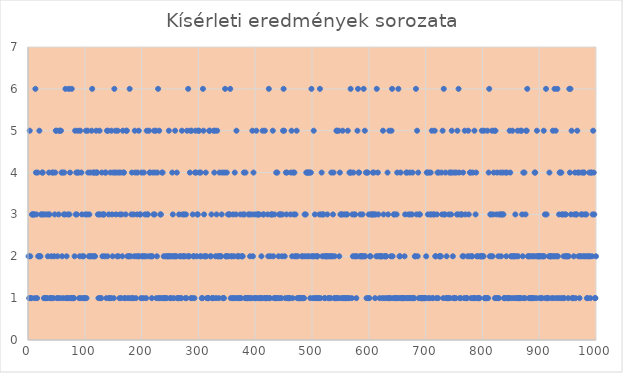
| Category | Series 0 |
|---|---|
| 1.0 | 2 |
| 2.0 | 1 |
| 3.0 | 5 |
| 4.0 | 2 |
| 5.0 | 1 |
| 6.0 | 1 |
| 7.0 | 3 |
| 8.0 | 3 |
| 9.0 | 3 |
| 10.0 | 3 |
| 11.0 | 3 |
| 12.0 | 1 |
| 13.0 | 6 |
| 14.0 | 4 |
| 15.0 | 3 |
| 16.0 | 1 |
| 17.0 | 4 |
| 18.0 | 2 |
| 19.0 | 2 |
| 20.0 | 5 |
| 21.0 | 2 |
| 22.0 | 2 |
| 23.0 | 3 |
| 24.0 | 3 |
| 25.0 | 4 |
| 26.0 | 4 |
| 27.0 | 3 |
| 28.0 | 1 |
| 29.0 | 3 |
| 30.0 | 1 |
| 31.0 | 1 |
| 32.0 | 1 |
| 33.0 | 3 |
| 34.0 | 1 |
| 35.0 | 2 |
| 36.0 | 3 |
| 37.0 | 4 |
| 38.0 | 3 |
| 39.0 | 1 |
| 40.0 | 1 |
| 41.0 | 2 |
| 42.0 | 1 |
| 43.0 | 4 |
| 44.0 | 4 |
| 45.0 | 1 |
| 46.0 | 2 |
| 47.0 | 3 |
| 48.0 | 4 |
| 49.0 | 5 |
| 50.0 | 5 |
| 51.0 | 1 |
| 52.0 | 2 |
| 53.0 | 1 |
| 54.0 | 3 |
| 55.0 | 5 |
| 56.0 | 5 |
| 57.0 | 1 |
| 58.0 | 5 |
| 59.0 | 4 |
| 60.0 | 2 |
| 61.0 | 4 |
| 62.0 | 1 |
| 63.0 | 3 |
| 64.0 | 4 |
| 65.0 | 3 |
| 66.0 | 6 |
| 67.0 | 1 |
| 68.0 | 2 |
| 69.0 | 1 |
| 70.0 | 3 |
| 71.0 | 1 |
| 72.0 | 6 |
| 73.0 | 3 |
| 74.0 | 4 |
| 75.0 | 1 |
| 76.0 | 1 |
| 77.0 | 6 |
| 78.0 | 1 |
| 79.0 | 1 |
| 80.0 | 1 |
| 81.0 | 1 |
| 82.0 | 2 |
| 83.0 | 5 |
| 84.0 | 3 |
| 85.0 | 4 |
| 86.0 | 3 |
| 87.0 | 4 |
| 88.0 | 5 |
| 89.0 | 4 |
| 90.0 | 1 |
| 91.0 | 2 |
| 92.0 | 5 |
| 93.0 | 1 |
| 94.0 | 4 |
| 95.0 | 3 |
| 96.0 | 2 |
| 97.0 | 1 |
| 98.0 | 2 |
| 99.0 | 1 |
| 100.0 | 1 |
| 101.0 | 3 |
| 102.0 | 5 |
| 103.0 | 1 |
| 104.0 | 3 |
| 105.0 | 5 |
| 106.0 | 4 |
| 107.0 | 2 |
| 108.0 | 3 |
| 109.0 | 2 |
| 110.0 | 4 |
| 111.0 | 2 |
| 112.0 | 5 |
| 113.0 | 6 |
| 114.0 | 2 |
| 115.0 | 4 |
| 116.0 | 4 |
| 117.0 | 2 |
| 118.0 | 2 |
| 119.0 | 4 |
| 120.0 | 5 |
| 121.0 | 4 |
| 122.0 | 4 |
| 123.0 | 3 |
| 124.0 | 1 |
| 125.0 | 3 |
| 126.0 | 5 |
| 127.0 | 1 |
| 128.0 | 3 |
| 129.0 | 1 |
| 130.0 | 4 |
| 131.0 | 2 |
| 132.0 | 3 |
| 133.0 | 3 |
| 134.0 | 3 |
| 135.0 | 2 |
| 136.0 | 4 |
| 137.0 | 4 |
| 138.0 | 1 |
| 139.0 | 5 |
| 140.0 | 2 |
| 141.0 | 5 |
| 142.0 | 3 |
| 143.0 | 1 |
| 144.0 | 1 |
| 145.0 | 4 |
| 146.0 | 1 |
| 147.0 | 5 |
| 148.0 | 3 |
| 149.0 | 2 |
| 150.0 | 4 |
| 151.0 | 1 |
| 152.0 | 6 |
| 153.0 | 4 |
| 154.0 | 5 |
| 155.0 | 3 |
| 156.0 | 4 |
| 157.0 | 2 |
| 158.0 | 5 |
| 159.0 | 2 |
| 160.0 | 4 |
| 161.0 | 1 |
| 162.0 | 3 |
| 163.0 | 4 |
| 164.0 | 1 |
| 165.0 | 3 |
| 166.0 | 2 |
| 167.0 | 5 |
| 168.0 | 4 |
| 169.0 | 4 |
| 170.0 | 1 |
| 171.0 | 1 |
| 172.0 | 3 |
| 173.0 | 5 |
| 174.0 | 5 |
| 175.0 | 2 |
| 176.0 | 1 |
| 177.0 | 2 |
| 178.0 | 2 |
| 179.0 | 6 |
| 180.0 | 1 |
| 181.0 | 2 |
| 182.0 | 3 |
| 183.0 | 4 |
| 184.0 | 1 |
| 185.0 | 1 |
| 186.0 | 3 |
| 187.0 | 2 |
| 188.0 | 5 |
| 189.0 | 4 |
| 190.0 | 1 |
| 191.0 | 2 |
| 192.0 | 3 |
| 193.0 | 4 |
| 194.0 | 2 |
| 195.0 | 5 |
| 196.0 | 2 |
| 197.0 | 3 |
| 198.0 | 3 |
| 199.0 | 1 |
| 200.0 | 4 |
| 201.0 | 2 |
| 202.0 | 2 |
| 203.0 | 1 |
| 204.0 | 4 |
| 205.0 | 2 |
| 206.0 | 3 |
| 207.0 | 2 |
| 208.0 | 1 |
| 209.0 | 5 |
| 210.0 | 3 |
| 211.0 | 3 |
| 212.0 | 2 |
| 213.0 | 5 |
| 214.0 | 4 |
| 215.0 | 4 |
| 216.0 | 2 |
| 217.0 | 2 |
| 218.0 | 1 |
| 219.0 | 2 |
| 220.0 | 4 |
| 221.0 | 3 |
| 222.0 | 5 |
| 223.0 | 3 |
| 224.0 | 4 |
| 225.0 | 5 |
| 226.0 | 1 |
| 227.0 | 2 |
| 228.0 | 4 |
| 229.0 | 6 |
| 230.0 | 1 |
| 231.0 | 5 |
| 232.0 | 1 |
| 233.0 | 3 |
| 234.0 | 3 |
| 235.0 | 1 |
| 236.0 | 4 |
| 237.0 | 4 |
| 238.0 | 1 |
| 239.0 | 2 |
| 240.0 | 1 |
| 241.0 | 1 |
| 242.0 | 2 |
| 243.0 | 1 |
| 244.0 | 1 |
| 245.0 | 2 |
| 246.0 | 2 |
| 247.0 | 2 |
| 248.0 | 5 |
| 249.0 | 2 |
| 250.0 | 1 |
| 251.0 | 2 |
| 252.0 | 1 |
| 253.0 | 2 |
| 254.0 | 4 |
| 255.0 | 3 |
| 256.0 | 2 |
| 257.0 | 1 |
| 258.0 | 2 |
| 259.0 | 5 |
| 260.0 | 2 |
| 261.0 | 2 |
| 262.0 | 4 |
| 263.0 | 1 |
| 264.0 | 1 |
| 265.0 | 1 |
| 266.0 | 3 |
| 267.0 | 2 |
| 268.0 | 1 |
| 269.0 | 2 |
| 270.0 | 1 |
| 271.0 | 5 |
| 272.0 | 3 |
| 273.0 | 2 |
| 274.0 | 2 |
| 275.0 | 3 |
| 276.0 | 2 |
| 277.0 | 1 |
| 278.0 | 3 |
| 279.0 | 1 |
| 280.0 | 5 |
| 281.0 | 2 |
| 282.0 | 6 |
| 283.0 | 2 |
| 284.0 | 2 |
| 285.0 | 4 |
| 286.0 | 5 |
| 287.0 | 1 |
| 288.0 | 5 |
| 289.0 | 1 |
| 290.0 | 3 |
| 291.0 | 2 |
| 292.0 | 2 |
| 293.0 | 1 |
| 294.0 | 4 |
| 295.0 | 5 |
| 296.0 | 4 |
| 297.0 | 2 |
| 298.0 | 3 |
| 299.0 | 3 |
| 300.0 | 5 |
| 301.0 | 5 |
| 302.0 | 4 |
| 303.0 | 2 |
| 304.0 | 4 |
| 305.0 | 2 |
| 306.0 | 1 |
| 307.0 | 1 |
| 308.0 | 6 |
| 309.0 | 5 |
| 310.0 | 3 |
| 311.0 | 2 |
| 312.0 | 2 |
| 313.0 | 4 |
| 314.0 | 2 |
| 315.0 | 1 |
| 316.0 | 1 |
| 317.0 | 1 |
| 318.0 | 1 |
| 319.0 | 5 |
| 320.0 | 5 |
| 321.0 | 2 |
| 322.0 | 2 |
| 323.0 | 3 |
| 324.0 | 1 |
| 325.0 | 1 |
| 326.0 | 1 |
| 327.0 | 5 |
| 328.0 | 4 |
| 329.0 | 5 |
| 330.0 | 2 |
| 331.0 | 1 |
| 332.0 | 3 |
| 333.0 | 5 |
| 334.0 | 2 |
| 335.0 | 2 |
| 336.0 | 1 |
| 337.0 | 4 |
| 338.0 | 2 |
| 339.0 | 2 |
| 340.0 | 2 |
| 341.0 | 3 |
| 342.0 | 4 |
| 343.0 | 1 |
| 344.0 | 1 |
| 345.0 | 1 |
| 346.0 | 4 |
| 347.0 | 6 |
| 348.0 | 2 |
| 349.0 | 2 |
| 350.0 | 4 |
| 351.0 | 2 |
| 352.0 | 3 |
| 353.0 | 2 |
| 354.0 | 3 |
| 355.0 | 3 |
| 356.0 | 6 |
| 357.0 | 1 |
| 358.0 | 2 |
| 359.0 | 2 |
| 360.0 | 1 |
| 361.0 | 3 |
| 362.0 | 1 |
| 363.0 | 2 |
| 364.0 | 4 |
| 365.0 | 1 |
| 366.0 | 3 |
| 367.0 | 5 |
| 368.0 | 1 |
| 369.0 | 2 |
| 370.0 | 2 |
| 371.0 | 2 |
| 372.0 | 1 |
| 373.0 | 1 |
| 374.0 | 3 |
| 375.0 | 1 |
| 376.0 | 2 |
| 377.0 | 2 |
| 378.0 | 2 |
| 379.0 | 3 |
| 380.0 | 4 |
| 381.0 | 3 |
| 382.0 | 1 |
| 383.0 | 4 |
| 384.0 | 1 |
| 385.0 | 1 |
| 386.0 | 1 |
| 387.0 | 1 |
| 388.0 | 3 |
| 389.0 | 1 |
| 390.0 | 3 |
| 391.0 | 2 |
| 392.0 | 1 |
| 393.0 | 1 |
| 394.0 | 3 |
| 395.0 | 5 |
| 396.0 | 2 |
| 397.0 | 4 |
| 398.0 | 1 |
| 399.0 | 3 |
| 400.0 | 1 |
| 401.0 | 1 |
| 402.0 | 5 |
| 403.0 | 3 |
| 404.0 | 1 |
| 405.0 | 3 |
| 406.0 | 3 |
| 407.0 | 3 |
| 408.0 | 1 |
| 409.0 | 1 |
| 410.0 | 1 |
| 411.0 | 2 |
| 412.0 | 1 |
| 413.0 | 5 |
| 414.0 | 3 |
| 415.0 | 3 |
| 416.0 | 1 |
| 417.0 | 5 |
| 418.0 | 1 |
| 419.0 | 1 |
| 420.0 | 1 |
| 421.0 | 1 |
| 422.0 | 3 |
| 423.0 | 2 |
| 424.0 | 6 |
| 425.0 | 1 |
| 426.0 | 1 |
| 427.0 | 2 |
| 428.0 | 3 |
| 429.0 | 3 |
| 430.0 | 3 |
| 431.0 | 5 |
| 432.0 | 2 |
| 433.0 | 1 |
| 434.0 | 3 |
| 435.0 | 1 |
| 436.0 | 1 |
| 437.0 | 4 |
| 438.0 | 1 |
| 439.0 | 4 |
| 440.0 | 1 |
| 441.0 | 2 |
| 442.0 | 3 |
| 443.0 | 1 |
| 444.0 | 3 |
| 445.0 | 3 |
| 446.0 | 1 |
| 447.0 | 2 |
| 448.0 | 3 |
| 449.0 | 5 |
| 450.0 | 6 |
| 451.0 | 5 |
| 452.0 | 2 |
| 453.0 | 1 |
| 454.0 | 4 |
| 455.0 | 3 |
| 456.0 | 4 |
| 457.0 | 1 |
| 458.0 | 1 |
| 459.0 | 1 |
| 460.0 | 1 |
| 461.0 | 1 |
| 462.0 | 3 |
| 463.0 | 4 |
| 464.0 | 5 |
| 465.0 | 2 |
| 466.0 | 1 |
| 467.0 | 4 |
| 468.0 | 3 |
| 469.0 | 4 |
| 470.0 | 2 |
| 471.0 | 3 |
| 472.0 | 2 |
| 473.0 | 5 |
| 474.0 | 1 |
| 475.0 | 2 |
| 476.0 | 1 |
| 477.0 | 1 |
| 478.0 | 1 |
| 479.0 | 1 |
| 480.0 | 1 |
| 481.0 | 1 |
| 482.0 | 2 |
| 483.0 | 1 |
| 484.0 | 2 |
| 485.0 | 1 |
| 486.0 | 1 |
| 487.0 | 3 |
| 488.0 | 2 |
| 489.0 | 3 |
| 490.0 | 4 |
| 491.0 | 4 |
| 492.0 | 2 |
| 493.0 | 4 |
| 494.0 | 4 |
| 495.0 | 2 |
| 496.0 | 4 |
| 497.0 | 1 |
| 498.0 | 4 |
| 499.0 | 6 |
| 500.0 | 2 |
| 501.0 | 2 |
| 502.0 | 1 |
| 503.0 | 5 |
| 504.0 | 2 |
| 505.0 | 3 |
| 506.0 | 1 |
| 507.0 | 1 |
| 508.0 | 2 |
| 509.0 | 2 |
| 510.0 | 2 |
| 511.0 | 1 |
| 512.0 | 1 |
| 513.0 | 3 |
| 514.0 | 6 |
| 515.0 | 1 |
| 516.0 | 3 |
| 517.0 | 4 |
| 518.0 | 2 |
| 519.0 | 3 |
| 520.0 | 3 |
| 521.0 | 2 |
| 522.0 | 1 |
| 523.0 | 1 |
| 524.0 | 2 |
| 525.0 | 2 |
| 526.0 | 2 |
| 527.0 | 3 |
| 528.0 | 2 |
| 529.0 | 1 |
| 530.0 | 1 |
| 531.0 | 2 |
| 532.0 | 2 |
| 533.0 | 1 |
| 534.0 | 4 |
| 535.0 | 2 |
| 536.0 | 2 |
| 537.0 | 3 |
| 538.0 | 4 |
| 539.0 | 1 |
| 540.0 | 2 |
| 541.0 | 1 |
| 542.0 | 1 |
| 543.0 | 5 |
| 544.0 | 5 |
| 545.0 | 1 |
| 546.0 | 1 |
| 547.0 | 5 |
| 548.0 | 2 |
| 549.0 | 4 |
| 550.0 | 3 |
| 551.0 | 1 |
| 552.0 | 3 |
| 553.0 | 3 |
| 554.0 | 5 |
| 555.0 | 1 |
| 556.0 | 1 |
| 557.0 | 3 |
| 558.0 | 1 |
| 559.0 | 1 |
| 560.0 | 3 |
| 561.0 | 1 |
| 562.0 | 3 |
| 563.0 | 5 |
| 564.0 | 1 |
| 565.0 | 1 |
| 566.0 | 4 |
| 567.0 | 4 |
| 568.0 | 6 |
| 569.0 | 4 |
| 570.0 | 1 |
| 571.0 | 3 |
| 572.0 | 2 |
| 573.0 | 4 |
| 574.0 | 3 |
| 575.0 | 2 |
| 576.0 | 3 |
| 577.0 | 2 |
| 578.0 | 1 |
| 579.0 | 2 |
| 580.0 | 5 |
| 581.0 | 6 |
| 582.0 | 4 |
| 583.0 | 4 |
| 584.0 | 2 |
| 585.0 | 3 |
| 586.0 | 2 |
| 587.0 | 2 |
| 588.0 | 2 |
| 589.0 | 3 |
| 590.0 | 2 |
| 591.0 | 6 |
| 592.0 | 2 |
| 593.0 | 5 |
| 594.0 | 2 |
| 595.0 | 4 |
| 596.0 | 1 |
| 597.0 | 4 |
| 598.0 | 4 |
| 599.0 | 1 |
| 600.0 | 3 |
| 601.0 | 1 |
| 602.0 | 2 |
| 603.0 | 2 |
| 604.0 | 3 |
| 605.0 | 3 |
| 606.0 | 3 |
| 607.0 | 4 |
| 608.0 | 3 |
| 609.0 | 4 |
| 610.0 | 3 |
| 611.0 | 1 |
| 612.0 | 3 |
| 613.0 | 2 |
| 614.0 | 6 |
| 615.0 | 2 |
| 616.0 | 4 |
| 617.0 | 3 |
| 618.0 | 2 |
| 619.0 | 1 |
| 620.0 | 2 |
| 621.0 | 2 |
| 622.0 | 2 |
| 623.0 | 2 |
| 624.0 | 1 |
| 625.0 | 5 |
| 626.0 | 3 |
| 627.0 | 2 |
| 628.0 | 1 |
| 629.0 | 2 |
| 630.0 | 2 |
| 631.0 | 2 |
| 632.0 | 1 |
| 633.0 | 4 |
| 634.0 | 3 |
| 635.0 | 1 |
| 636.0 | 5 |
| 637.0 | 1 |
| 638.0 | 1 |
| 639.0 | 2 |
| 640.0 | 5 |
| 641.0 | 6 |
| 642.0 | 2 |
| 643.0 | 1 |
| 644.0 | 3 |
| 645.0 | 3 |
| 646.0 | 1 |
| 647.0 | 1 |
| 648.0 | 1 |
| 649.0 | 3 |
| 650.0 | 4 |
| 651.0 | 1 |
| 652.0 | 6 |
| 653.0 | 1 |
| 654.0 | 2 |
| 655.0 | 2 |
| 656.0 | 4 |
| 657.0 | 1 |
| 658.0 | 1 |
| 659.0 | 1 |
| 660.0 | 1 |
| 661.0 | 1 |
| 662.0 | 1 |
| 663.0 | 2 |
| 664.0 | 3 |
| 665.0 | 1 |
| 666.0 | 4 |
| 667.0 | 4 |
| 668.0 | 1 |
| 669.0 | 1 |
| 670.0 | 3 |
| 671.0 | 1 |
| 672.0 | 4 |
| 673.0 | 3 |
| 674.0 | 1 |
| 675.0 | 1 |
| 676.0 | 3 |
| 677.0 | 4 |
| 678.0 | 1 |
| 679.0 | 1 |
| 680.0 | 1 |
| 681.0 | 2 |
| 682.0 | 2 |
| 683.0 | 6 |
| 684.0 | 3 |
| 685.0 | 5 |
| 686.0 | 2 |
| 687.0 | 4 |
| 688.0 | 1 |
| 689.0 | 3 |
| 690.0 | 3 |
| 691.0 | 1 |
| 692.0 | 1 |
| 693.0 | 1 |
| 694.0 | 1 |
| 695.0 | 1 |
| 696.0 | 1 |
| 697.0 | 1 |
| 698.0 | 1 |
| 699.0 | 1 |
| 700.0 | 1 |
| 701.0 | 2 |
| 702.0 | 4 |
| 703.0 | 4 |
| 704.0 | 3 |
| 705.0 | 1 |
| 706.0 | 4 |
| 707.0 | 1 |
| 708.0 | 3 |
| 709.0 | 4 |
| 710.0 | 3 |
| 711.0 | 5 |
| 712.0 | 1 |
| 713.0 | 1 |
| 714.0 | 3 |
| 715.0 | 3 |
| 716.0 | 5 |
| 717.0 | 2 |
| 718.0 | 2 |
| 719.0 | 1 |
| 720.0 | 3 |
| 721.0 | 4 |
| 722.0 | 1 |
| 723.0 | 4 |
| 724.0 | 2 |
| 725.0 | 2 |
| 726.0 | 2 |
| 727.0 | 2 |
| 728.0 | 4 |
| 729.0 | 3 |
| 730.0 | 5 |
| 731.0 | 1 |
| 732.0 | 6 |
| 733.0 | 3 |
| 734.0 | 3 |
| 735.0 | 4 |
| 736.0 | 1 |
| 737.0 | 2 |
| 738.0 | 1 |
| 739.0 | 1 |
| 740.0 | 1 |
| 741.0 | 3 |
| 742.0 | 4 |
| 743.0 | 1 |
| 744.0 | 4 |
| 745.0 | 3 |
| 746.0 | 5 |
| 747.0 | 4 |
| 748.0 | 2 |
| 749.0 | 1 |
| 750.0 | 1 |
| 751.0 | 4 |
| 752.0 | 1 |
| 753.0 | 1 |
| 754.0 | 4 |
| 755.0 | 3 |
| 756.0 | 5 |
| 757.0 | 3 |
| 758.0 | 6 |
| 759.0 | 4 |
| 760.0 | 1 |
| 761.0 | 3 |
| 762.0 | 1 |
| 763.0 | 3 |
| 764.0 | 3 |
| 765.0 | 2 |
| 766.0 | 4 |
| 767.0 | 2 |
| 768.0 | 1 |
| 769.0 | 5 |
| 770.0 | 3 |
| 771.0 | 1 |
| 772.0 | 1 |
| 773.0 | 1 |
| 774.0 | 2 |
| 775.0 | 5 |
| 776.0 | 3 |
| 777.0 | 2 |
| 778.0 | 4 |
| 779.0 | 4 |
| 780.0 | 1 |
| 781.0 | 2 |
| 782.0 | 2 |
| 783.0 | 4 |
| 784.0 | 1 |
| 785.0 | 1 |
| 786.0 | 5 |
| 787.0 | 1 |
| 788.0 | 3 |
| 789.0 | 4 |
| 790.0 | 2 |
| 791.0 | 1 |
| 792.0 | 2 |
| 793.0 | 1 |
| 794.0 | 1 |
| 795.0 | 1 |
| 796.0 | 2 |
| 797.0 | 2 |
| 798.0 | 2 |
| 799.0 | 5 |
| 800.0 | 2 |
| 801.0 | 2 |
| 802.0 | 2 |
| 803.0 | 5 |
| 804.0 | 1 |
| 805.0 | 1 |
| 806.0 | 1 |
| 807.0 | 1 |
| 808.0 | 1 |
| 809.0 | 5 |
| 810.0 | 1 |
| 811.0 | 4 |
| 812.0 | 6 |
| 813.0 | 2 |
| 814.0 | 3 |
| 815.0 | 3 |
| 816.0 | 2 |
| 817.0 | 5 |
| 818.0 | 2 |
| 819.0 | 3 |
| 820.0 | 4 |
| 821.0 | 5 |
| 822.0 | 1 |
| 823.0 | 5 |
| 824.0 | 1 |
| 825.0 | 3 |
| 826.0 | 4 |
| 827.0 | 1 |
| 828.0 | 2 |
| 829.0 | 1 |
| 830.0 | 3 |
| 831.0 | 3 |
| 832.0 | 4 |
| 833.0 | 2 |
| 834.0 | 3 |
| 835.0 | 3 |
| 836.0 | 4 |
| 837.0 | 3 |
| 838.0 | 1 |
| 839.0 | 1 |
| 840.0 | 1 |
| 841.0 | 4 |
| 842.0 | 2 |
| 843.0 | 4 |
| 844.0 | 1 |
| 845.0 | 1 |
| 846.0 | 1 |
| 847.0 | 1 |
| 848.0 | 5 |
| 849.0 | 4 |
| 850.0 | 2 |
| 851.0 | 1 |
| 852.0 | 2 |
| 853.0 | 5 |
| 854.0 | 2 |
| 855.0 | 1 |
| 856.0 | 2 |
| 857.0 | 2 |
| 858.0 | 3 |
| 859.0 | 1 |
| 860.0 | 2 |
| 861.0 | 1 |
| 862.0 | 5 |
| 863.0 | 2 |
| 864.0 | 1 |
| 865.0 | 1 |
| 866.0 | 1 |
| 867.0 | 5 |
| 868.0 | 1 |
| 869.0 | 5 |
| 870.0 | 3 |
| 871.0 | 2 |
| 872.0 | 4 |
| 873.0 | 1 |
| 874.0 | 4 |
| 875.0 | 1 |
| 876.0 | 3 |
| 877.0 | 5 |
| 878.0 | 5 |
| 879.0 | 6 |
| 880.0 | 2 |
| 881.0 | 2 |
| 882.0 | 1 |
| 883.0 | 2 |
| 884.0 | 1 |
| 885.0 | 2 |
| 886.0 | 1 |
| 887.0 | 1 |
| 888.0 | 1 |
| 889.0 | 2 |
| 890.0 | 2 |
| 891.0 | 1 |
| 892.0 | 4 |
| 893.0 | 4 |
| 894.0 | 2 |
| 895.0 | 1 |
| 896.0 | 5 |
| 897.0 | 2 |
| 898.0 | 2 |
| 899.0 | 2 |
| 900.0 | 2 |
| 901.0 | 1 |
| 902.0 | 2 |
| 903.0 | 2 |
| 904.0 | 1 |
| 905.0 | 1 |
| 906.0 | 2 |
| 907.0 | 2 |
| 908.0 | 5 |
| 909.0 | 2 |
| 910.0 | 3 |
| 911.0 | 1 |
| 912.0 | 6 |
| 913.0 | 3 |
| 914.0 | 1 |
| 915.0 | 1 |
| 916.0 | 1 |
| 917.0 | 2 |
| 918.0 | 4 |
| 919.0 | 2 |
| 920.0 | 2 |
| 921.0 | 2 |
| 922.0 | 1 |
| 923.0 | 2 |
| 924.0 | 5 |
| 925.0 | 1 |
| 926.0 | 2 |
| 927.0 | 6 |
| 928.0 | 2 |
| 929.0 | 5 |
| 930.0 | 1 |
| 931.0 | 2 |
| 932.0 | 6 |
| 933.0 | 2 |
| 934.0 | 1 |
| 935.0 | 3 |
| 936.0 | 4 |
| 937.0 | 4 |
| 938.0 | 1 |
| 939.0 | 4 |
| 940.0 | 3 |
| 941.0 | 3 |
| 942.0 | 1 |
| 943.0 | 2 |
| 944.0 | 1 |
| 945.0 | 3 |
| 946.0 | 2 |
| 947.0 | 3 |
| 948.0 | 2 |
| 949.0 | 2 |
| 950.0 | 2 |
| 951.0 | 1 |
| 952.0 | 2 |
| 953.0 | 6 |
| 954.0 | 4 |
| 955.0 | 6 |
| 956.0 | 3 |
| 957.0 | 5 |
| 958.0 | 1 |
| 959.0 | 1 |
| 960.0 | 1 |
| 961.0 | 2 |
| 962.0 | 3 |
| 963.0 | 4 |
| 964.0 | 1 |
| 965.0 | 3 |
| 966.0 | 3 |
| 967.0 | 5 |
| 968.0 | 4 |
| 969.0 | 2 |
| 970.0 | 4 |
| 971.0 | 1 |
| 972.0 | 2 |
| 973.0 | 2 |
| 974.0 | 3 |
| 975.0 | 4 |
| 976.0 | 3 |
| 977.0 | 2 |
| 978.0 | 4 |
| 979.0 | 4 |
| 980.0 | 2 |
| 981.0 | 3 |
| 982.0 | 2 |
| 983.0 | 3 |
| 984.0 | 1 |
| 985.0 | 1 |
| 986.0 | 2 |
| 987.0 | 2 |
| 988.0 | 4 |
| 989.0 | 2 |
| 990.0 | 1 |
| 991.0 | 4 |
| 992.0 | 4 |
| 993.0 | 2 |
| 994.0 | 3 |
| 995.0 | 5 |
| 996.0 | 4 |
| 997.0 | 3 |
| 998.0 | 1 |
| 999.0 | 1 |
| 1000.0 | 2 |